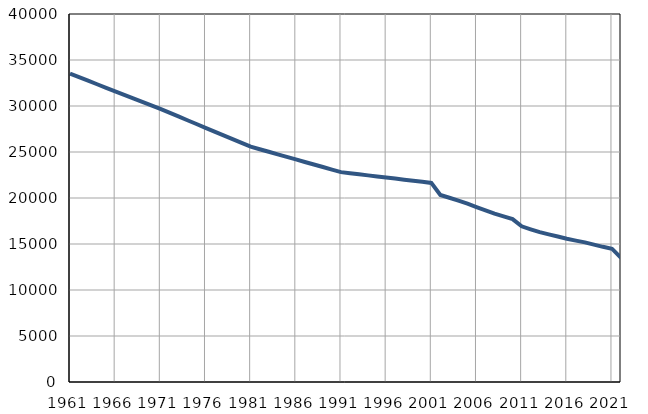
| Category | Population
size |
|---|---|
| 1961.0 | 33514 |
| 1962.0 | 33131 |
| 1963.0 | 32748 |
| 1964.0 | 32365 |
| 1965.0 | 31982 |
| 1966.0 | 31599 |
| 1967.0 | 31216 |
| 1968.0 | 30833 |
| 1969.0 | 30450 |
| 1970.0 | 30067 |
| 1971.0 | 29684 |
| 1972.0 | 29274 |
| 1973.0 | 28863 |
| 1974.0 | 28453 |
| 1975.0 | 28042 |
| 1976.0 | 27632 |
| 1977.0 | 27221 |
| 1978.0 | 26811 |
| 1979.0 | 26400 |
| 1980.0 | 25990 |
| 1981.0 | 25579 |
| 1982.0 | 25302 |
| 1983.0 | 25025 |
| 1984.0 | 24749 |
| 1985.0 | 24472 |
| 1986.0 | 24195 |
| 1987.0 | 23918 |
| 1988.0 | 23641 |
| 1989.0 | 23365 |
| 1990.0 | 23088 |
| 1991.0 | 22811 |
| 1992.0 | 22694 |
| 1993.0 | 22577 |
| 1994.0 | 22460 |
| 1995.0 | 22343 |
| 1996.0 | 22226 |
| 1997.0 | 22109 |
| 1998.0 | 21992 |
| 1999.0 | 21875 |
| 2000.0 | 21758 |
| 2001.0 | 21641 |
| 2002.0 | 20322 |
| 2003.0 | 20026 |
| 2004.0 | 19725 |
| 2005.0 | 19383 |
| 2006.0 | 19014 |
| 2007.0 | 18661 |
| 2008.0 | 18307 |
| 2009.0 | 18005 |
| 2010.0 | 17708 |
| 2011.0 | 16921 |
| 2012.0 | 16600 |
| 2013.0 | 16295 |
| 2014.0 | 16050 |
| 2015.0 | 15814 |
| 2016.0 | 15573 |
| 2017.0 | 15369 |
| 2018.0 | 15173 |
| 2019.0 | 14926 |
| 2020.0 | 14693 |
| 2021.0 | 14487 |
| 2022.0 | 13489 |